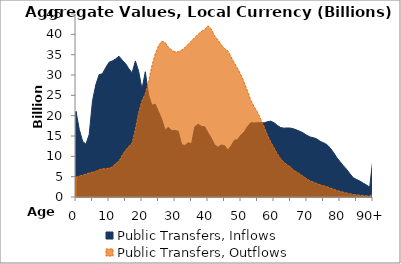
| Category | Public Transfers, Inflows | Public Transfers, Outflows |
|---|---|---|
| 0 | 21035.091 | 4856.882 |
|  | 16589.596 | 5129.596 |
| 2 | 13723.419 | 5356.046 |
| 3 | 12979.46 | 5644.856 |
| 4 | 15377.887 | 5886.61 |
| 5 | 23651.03 | 6104.352 |
| 6 | 27589.861 | 6304.824 |
| 7 | 30085.42 | 6699.647 |
| 8 | 30307.478 | 6925.774 |
| 9 | 31783.162 | 6952.526 |
| 10 | 33119.647 | 7082.524 |
| 11 | 33476.572 | 7361.776 |
| 12 | 33928.19 | 8224.062 |
| 13 | 34634.925 | 8791.109 |
| 14 | 33659.843 | 10241.052 |
| 15 | 32830.581 | 11485.567 |
| 16 | 31552.023 | 12438.688 |
| 17 | 30507.759 | 13243.771 |
| 18 | 33458.493 | 16634.606 |
| 19 | 30877.651 | 20774.616 |
| 20 | 26501.231 | 23696.982 |
| 21 | 30804.036 | 25396.484 |
| 22 | 25079.735 | 28359.371 |
| 23 | 22558.068 | 32246.566 |
| 24 | 22840.628 | 35169.476 |
| 25 | 20986.611 | 37153.939 |
| 26 | 19076.968 | 38314.798 |
| 27 | 16463.146 | 38003.351 |
| 28 | 17152.977 | 36818.753 |
| 29 | 16320.696 | 36138.379 |
| 30 | 16350.923 | 35670.153 |
| 31 | 16162.563 | 35694.72 |
| 32 | 12885.674 | 36126.706 |
| 33 | 12653.724 | 36736.243 |
| 34 | 13357.384 | 37580.089 |
| 35 | 13058.436 | 38376.327 |
| 36 | 17279.844 | 39191.441 |
| 37 | 17895.875 | 40010.651 |
| 38 | 17380.981 | 40702.349 |
| 39 | 17292.991 | 41160.752 |
| 40 | 15813.053 | 42100.636 |
| 41 | 14457.145 | 41297.079 |
| 42 | 12846.809 | 39581.807 |
| 43 | 12247.07 | 38653.532 |
| 44 | 12780.363 | 37477.393 |
| 45 | 12651.766 | 36516.055 |
| 46 | 11597.962 | 35907.327 |
| 47 | 12550.635 | 34425.358 |
| 48 | 13975.201 | 32932.476 |
| 49 | 14122.373 | 31566.707 |
| 50 | 15293.227 | 30023.31 |
| 51 | 16023.275 | 28120.942 |
| 52 | 17346.19 | 25913.97 |
| 53 | 18287.344 | 23721.92 |
| 54 | 18182.038 | 22176.649 |
| 55 | 18275.189 | 20850.69 |
| 56 | 18286.59 | 19066.404 |
| 57 | 18234.303 | 17304.942 |
| 58 | 18509.888 | 15213.123 |
| 59 | 18646.877 | 13531.983 |
| 60 | 18277.217 | 12142.914 |
| 61 | 17619.85 | 10629.639 |
| 62 | 17092.286 | 9425.823 |
| 63 | 16926.706 | 8544.519 |
| 64 | 16978.031 | 7910.06 |
| 65 | 16945.997 | 7377.521 |
| 66 | 16741.769 | 6577.608 |
| 67 | 16444.408 | 6082.769 |
| 68 | 16107.271 | 5556.6 |
| 69 | 15677.117 | 4988.668 |
| 70 | 15144.564 | 4433.801 |
| 71 | 14738.757 | 3941.943 |
| 72 | 14585.396 | 3636.303 |
| 73 | 14261.095 | 3291.182 |
| 74 | 13690.951 | 2983.024 |
| 75 | 13332.851 | 2764.972 |
| 76 | 12888.525 | 2527.839 |
| 77 | 12094.808 | 2227.064 |
| 78 | 10994.134 | 1929.015 |
| 79 | 9737.76 | 1628.367 |
| 80 | 8704.125 | 1397.55 |
| 81 | 7707.74 | 1184.352 |
| 82 | 6803.049 | 992.27 |
| 83 | 5732.714 | 791.054 |
| 84 | 4733.71 | 615.128 |
| 85 | 4322.038 | 525.789 |
| 86 | 3929.788 | 446.407 |
| 87 | 3427.067 | 361.713 |
| 88 | 2963.281 | 288.178 |
| 89 | 2430.625 | 221.105 |
| 90+ | 9631.383 | 837.999 |